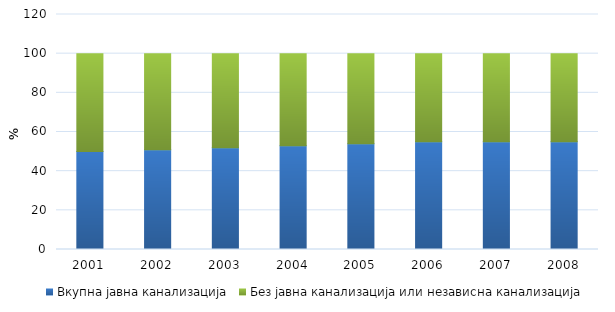
| Category | Вкупна јавна канализација | Без јавна канализација или независна канализација |
|---|---|---|
| 2001.0 | 50 | 50 |
| 2002.0 | 51 | 49 |
| 2003.0 | 52 | 48 |
| 2004.0 | 53 | 47 |
| 2005.0 | 54 | 46 |
| 2006.0 | 55 | 45 |
| 2007.0 | 55 | 45 |
| 2008.0 | 55 | 45 |